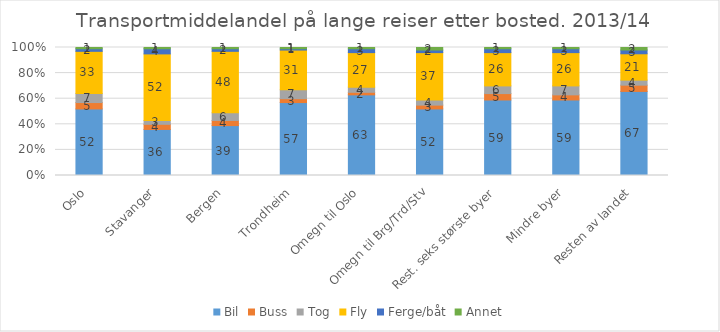
| Category | Bil | Buss | Tog | Fly | Ferge/båt | Annet |
|---|---|---|---|---|---|---|
| Oslo | 52 | 5 | 7 | 33 | 2 | 1 |
| Stavanger | 36 | 4 | 3 | 52 | 4 | 1 |
| Bergen | 39 | 4 | 6 | 48 | 2 | 1 |
| Trondheim | 57 | 3 | 7 | 31 | 1 | 1 |
| Omegn til Oslo | 63 | 2 | 4 | 27 | 3 | 1 |
| Omegn til Brg/Trd/Stv | 52 | 3 | 4 | 37 | 2 | 2 |
| Rest. seks største byer | 59 | 5 | 6 | 26 | 3 | 1 |
| Mindre byer | 59 | 4 | 7 | 26 | 3 | 1 |
| Resten av landet | 67 | 5 | 4 | 21 | 3 | 2 |